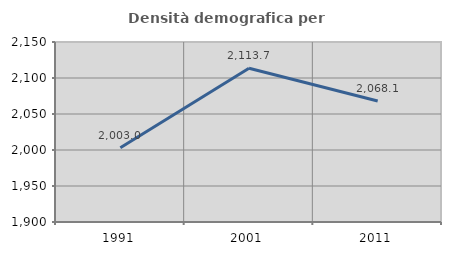
| Category | Densità demografica |
|---|---|
| 1991.0 | 2002.997 |
| 2001.0 | 2113.65 |
| 2011.0 | 2068.121 |